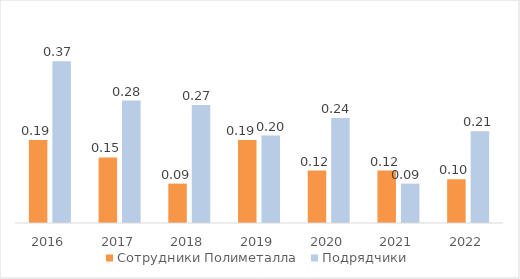
| Category | Сотрудники Полиметалла | Подрядчики |
|---|---|---|
| 2016.0 | 0.19 | 0.37 |
| 2017.0 | 0.15 | 0.28 |
| 2018.0 | 0.09 | 0.27 |
| 2019.0 | 0.19 | 0.2 |
| 2020.0 | 0.12 | 0.24 |
| 2021.0 | 0.12 | 0.09 |
| 2022.0 | 0.1 | 0.21 |